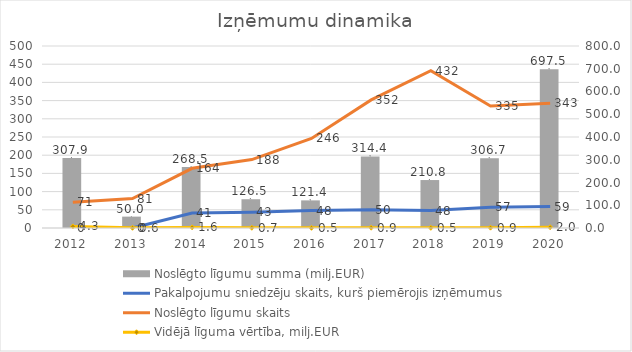
| Category | Noslēgto līgumu summa (milj.EUR) |
|---|---|
| 2012.0 | 307.912 |
| 2013.0 | 50.012 |
| 2014.0 | 268.503 |
| 2015.0 | 126.516 |
| 2016.0 | 121.4 |
| 2017.0 | 314.424 |
| 2018.0 | 210.8 |
| 2019.0 | 306.7 |
| 2020.0 | 697.5 |